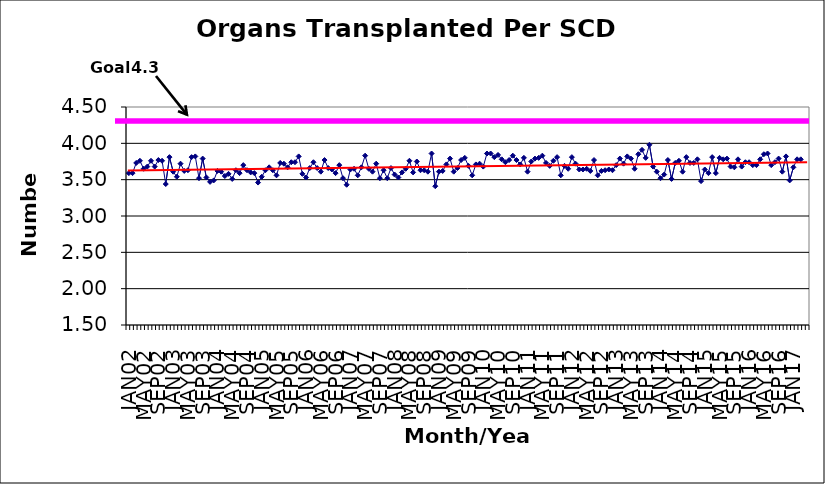
| Category | Series 0 |
|---|---|
| JAN02 | 3.59 |
| FEB02 | 3.59 |
| MAR02 | 3.73 |
| APR02 | 3.76 |
| MAY02 | 3.65 |
| JUN02 | 3.68 |
| JUL02 | 3.76 |
| AUG02 | 3.68 |
| SEP02 | 3.77 |
| OCT02 | 3.76 |
| NOV02 | 3.44 |
| DEC02 | 3.81 |
| JAN03 | 3.61 |
| FEB03 | 3.54 |
| MAR03 | 3.72 |
| APR03 | 3.62 |
| MAY03 | 3.63 |
| JUN03 | 3.81 |
| JUL03 | 3.82 |
| AUG03 | 3.52 |
| SEP03 | 3.79 |
| OCT03 | 3.53 |
| NOV03 | 3.47 |
| DEC03 | 3.49 |
| JAN04 | 3.62 |
| FEB04 | 3.61 |
| MAR04 | 3.55 |
| APR04 | 3.58 |
| MAY04 | 3.51 |
| JUN04 | 3.63 |
| JUL04 | 3.59 |
| AUG04 | 3.7 |
| SEP04 | 3.63 |
| OCT04 | 3.6 |
| NOV04 | 3.59 |
| DEC04 | 3.46 |
| JAN05 | 3.54 |
| FEB05 | 3.63 |
| MAR05 | 3.67 |
| APR05 | 3.63 |
| MAY05 | 3.56 |
| JUN05 | 3.73 |
| JUL05 | 3.72 |
| AUG05 | 3.67 |
| SEP05 | 3.74 |
| OCT05 | 3.74 |
| NOV05 | 3.82 |
| DEC05 | 3.58 |
| JAN06 | 3.53 |
| FEB06 | 3.66 |
| MAR06 | 3.74 |
| APR06 | 3.66 |
| MAY06 | 3.61 |
| JUN06 | 3.77 |
| JUL06 | 3.66 |
| AUG06 | 3.64 |
| SEP06 | 3.59 |
| OCT06 | 3.7 |
| NOV06 | 3.52 |
| DEC06 | 3.43 |
| JAN07 | 3.64 |
| FEB07 | 3.65 |
| MAR07 | 3.56 |
| APR07 | 3.67 |
| MAY07 | 3.83 |
| JUN07 | 3.65 |
| JUL07 | 3.61 |
| AUG07 | 3.72 |
| SEP07 | 3.52 |
| OCT07 | 3.63 |
| NOV07 | 3.52 |
| DEC07 | 3.66 |
| JAN08 | 3.57 |
| FEB08 | 3.53 |
| MAR08 | 3.6 |
| APR08 | 3.65 |
| MAY08 | 3.76 |
| JUN08 | 3.6 |
| JUL08 | 3.75 |
| AUG08 | 3.63 |
| SEP08 | 3.63 |
| OCT08 | 3.61 |
| NOV08 | 3.86 |
| DEC08 | 3.41 |
| JAN09 | 3.61 |
| FEB09 | 3.62 |
| MAR09 | 3.71 |
| APR09 | 3.79 |
| MAY09 | 3.61 |
| JUN09 | 3.66 |
| JUL09 | 3.77 |
| AUG09 | 3.8 |
| SEP09 | 3.69 |
| OCT09 | 3.56 |
| NOV09 | 3.71 |
| DEC09 | 3.72 |
| JAN10 | 3.68 |
| FEB10 | 3.86 |
| MAR10 | 3.86 |
| APR10 | 3.81 |
| MAY10 | 3.84 |
| JUN10 | 3.78 |
| JUL10 | 3.74 |
| AUG10 | 3.77 |
| SEP10 | 3.83 |
| OCT10 | 3.77 |
| NOV10 | 3.71 |
| DEC10 | 3.8 |
| JAN11 | 3.61 |
| FEB11 | 3.75 |
| MAR11 | 3.79 |
| APR11 | 3.8 |
| MAY11 | 3.83 |
| JUN11 | 3.73 |
| JUL11 | 3.69 |
| AUG11 | 3.76 |
| SEP11 | 3.81 |
| OCT11 | 3.56 |
| NOV11 | 3.69 |
| DEC11 | 3.65 |
| JAN12 | 3.81 |
| FEB12 | 3.72 |
| MAR12 | 3.64 |
| APR12 | 3.64 |
| MAY12 | 3.65 |
| JUN12 | 3.62 |
| JUL12 | 3.77 |
| AUG12 | 3.56 |
| SEP12 | 3.62 |
| OCT12 | 3.63 |
| NOV12 | 3.64 |
| DEC12 | 3.63 |
| JAN13 | 3.7 |
| FEB13 | 3.79 |
| MAR13 | 3.72 |
| APR13 | 3.82 |
| MAY13 | 3.79 |
| JUN13 | 3.65 |
| JUL13 | 3.85 |
| AUG13 | 3.91 |
| SEP13 | 3.8 |
| OCT13 | 3.98 |
| NOV13 | 3.68 |
| DEC13 | 3.61 |
| JAN14 | 3.52 |
| FEB14 | 3.57 |
| MAR14 | 3.77 |
| APR14 | 3.51 |
| MAY14 | 3.73 |
| JUN14 | 3.76 |
| JUL14 | 3.61 |
| AUG14 | 3.81 |
| SEP14 | 3.73 |
| OCT14 | 3.73 |
| NOV14 | 3.78 |
| DEC14 | 3.48 |
| JAN15 | 3.64 |
| FEB15 | 3.59 |
| MAR15 | 3.81 |
| APR15 | 3.59 |
| MAY15 | 3.8 |
| JUN15 | 3.78 |
| JUL15 | 3.79 |
| AUG15 | 3.68 |
| SEP15 | 3.67 |
| OCT15 | 3.78 |
| NOV15 | 3.68 |
| DEC15 | 3.74 |
| JAN16 | 3.74 |
| FEB16 | 3.7 |
| MAR16 | 3.7 |
| APR16 | 3.78 |
| MAY16 | 3.85 |
| JUN16 | 3.86 |
| JUL16 | 3.7 |
| AUG16 | 3.74 |
| SEP16 | 3.79 |
| OCT16 | 3.61 |
| NOV16 | 3.82 |
| DEC16 | 3.49 |
| JAN17 | 3.67 |
| FEB17 | 3.78 |
| MAR17 | 3.78 |